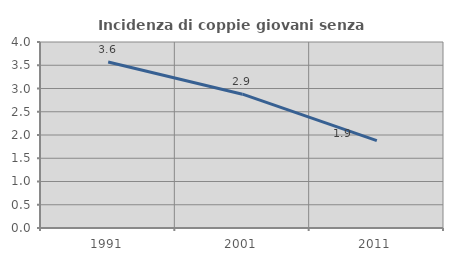
| Category | Incidenza di coppie giovani senza figli |
|---|---|
| 1991.0 | 3.571 |
| 2001.0 | 2.878 |
| 2011.0 | 1.88 |